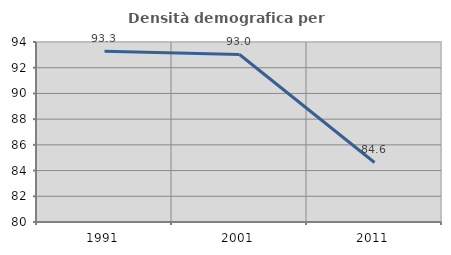
| Category | Densità demografica |
|---|---|
| 1991.0 | 93.284 |
| 2001.0 | 93.028 |
| 2011.0 | 84.629 |